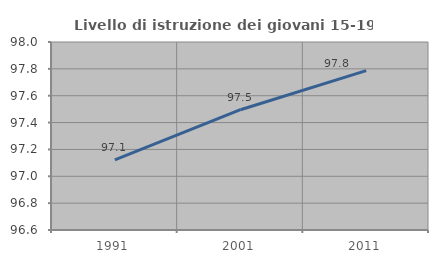
| Category | Livello di istruzione dei giovani 15-19 anni |
|---|---|
| 1991.0 | 97.122 |
| 2001.0 | 97.496 |
| 2011.0 | 97.787 |